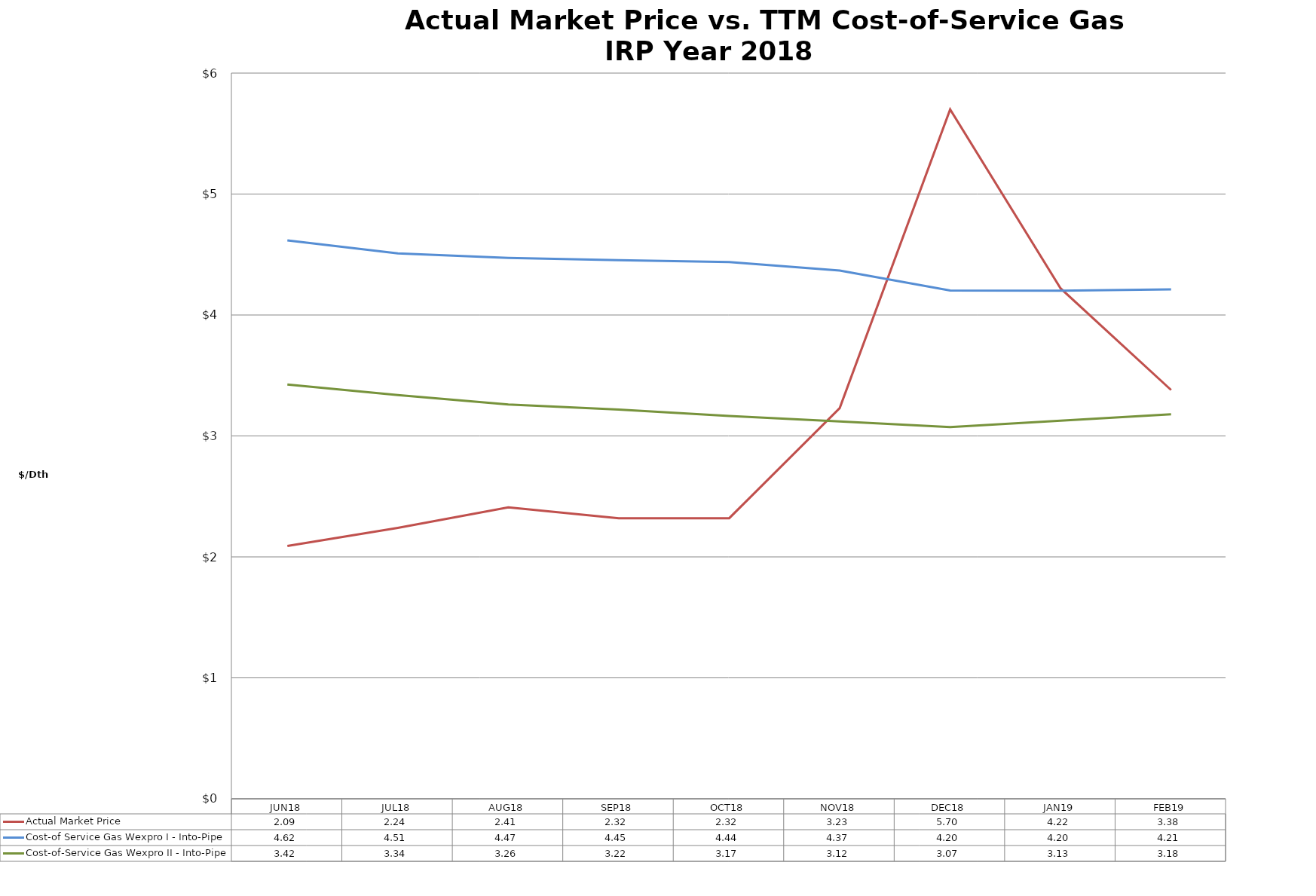
| Category | Actual Market Price | Cost-of Service Gas Wexpro I - Into-Pipe | Cost-of-Service Gas Wexpro II - Into-Pipe |
|---|---|---|---|
| JUN18 | 2.09 | 4.616 | 3.425 |
| JUL18 | 2.24 | 4.509 | 3.338 |
| AUG18 | 2.41 | 4.472 | 3.261 |
| SEP18 | 2.32 | 4.453 | 3.219 |
| OCT18 | 2.32 | 4.437 | 3.165 |
| NOV18 | 3.23 | 4.367 | 3.121 |
| DEC18 | 5.7 | 4.202 | 3.073 |
| JAN19 | 4.22 | 4.202 | 3.126 |
| FEB19 | 3.38 | 4.211 | 3.18 |